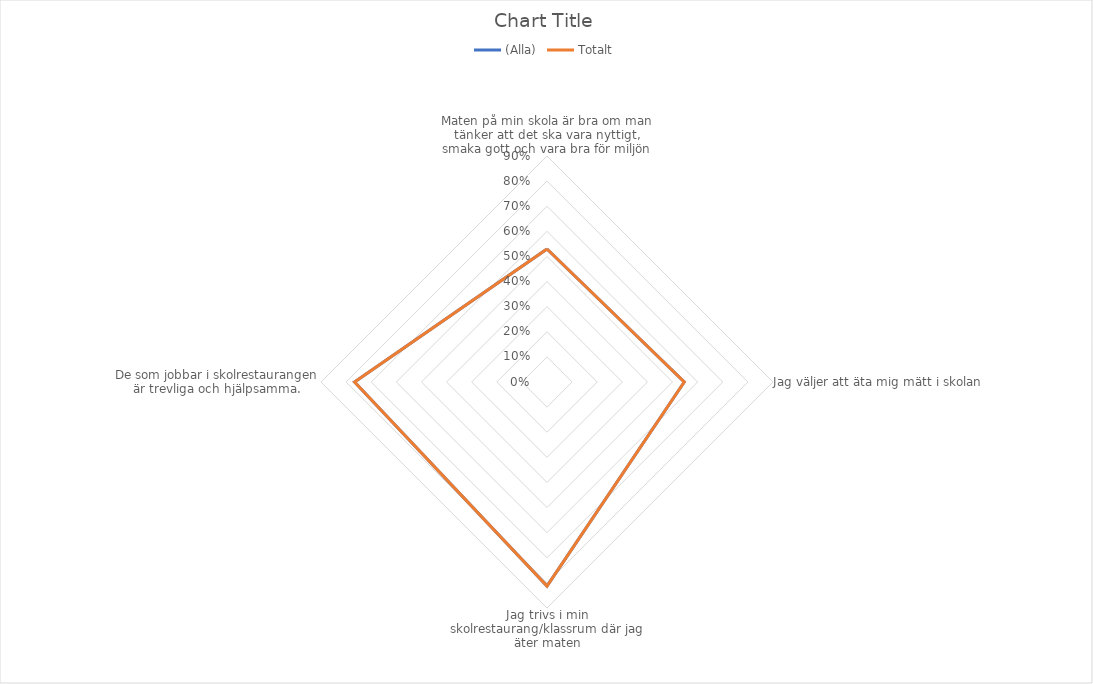
| Category | (Alla) | Totalt |
|---|---|---|
| Maten på min skola är bra om man tänker att det ska vara nyttigt, smaka gott och vara bra för miljön | 0.53 | 0.53 |
| Jag väljer att äta mig mätt i skolan | 0.547 | 0.547 |
| Jag trivs i min skolrestaurang/klassrum där jag äter maten | 0.812 | 0.812 |
| De som jobbar i skolrestaurangen är trevliga och hjälpsamma. | 0.766 | 0.766 |